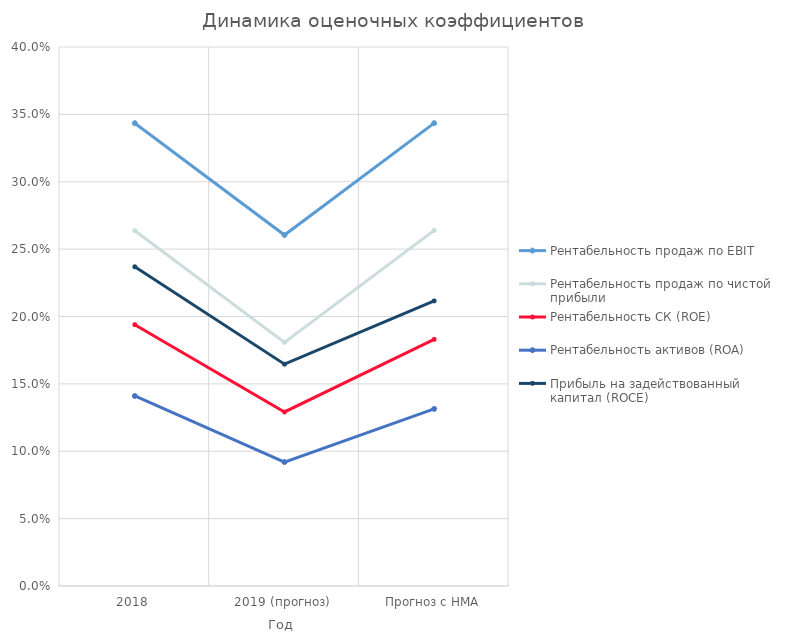
| Category | Рентабельность продаж по EBIT | Рентабельность продаж по чистой прибыли | Рентабельность СК (ROE) | Рентабельность активов (ROA) | Прибыль на задействованный капитал (ROCE) |
|---|---|---|---|---|---|
| 2018 | 0.343 | 0.264 | 0.194 | 0.141 | 0.237 |
| 2019 (прогноз) | 0.26 | 0.181 | 0.129 | 0.092 | 0.165 |
| Прогноз с НМА | 0.344 | 0.264 | 0.183 | 0.131 | 0.212 |